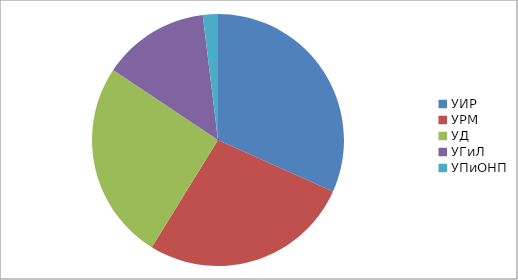
| Category | Series 0 |
|---|---|
| УИР | 196586798.96 |
| УРМ | 168043521.2 |
| УД | 158413867.96 |
| УГиЛ | 85000000 |
| УПиОНП | 12000000 |